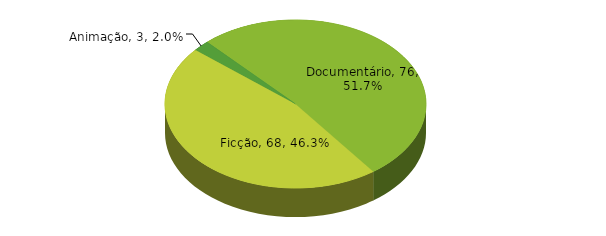
| Category | Series 0 |
|---|---|
| Animação | 3 |
| Documentário | 76 |
| Ficção | 68 |